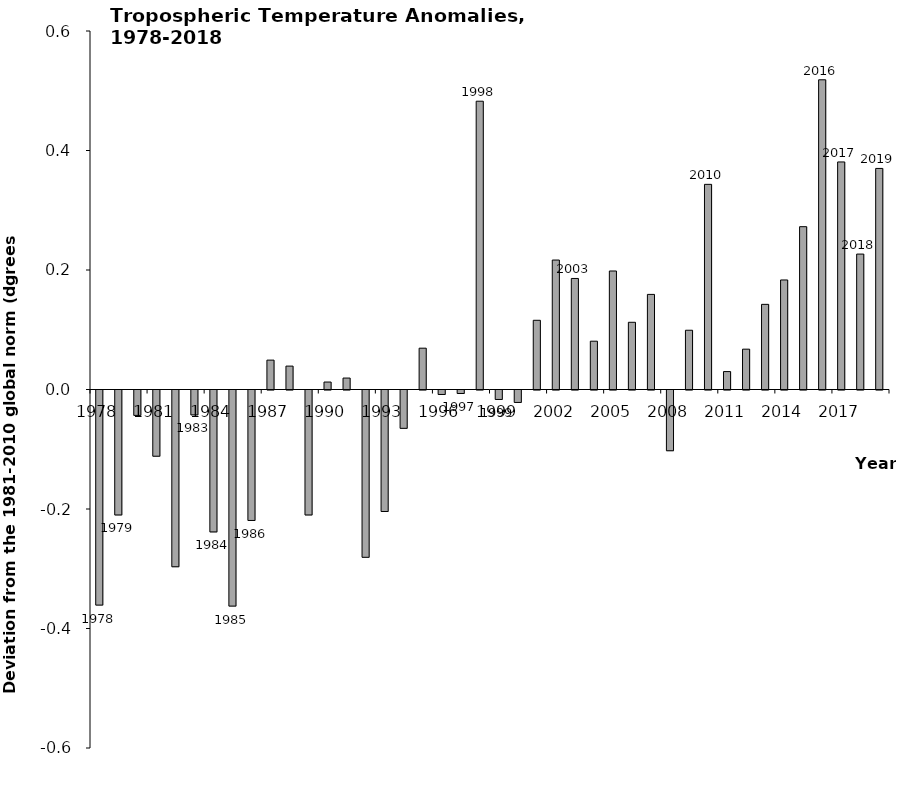
| Category | Series 0 |
|---|---|
| 1978.0 | -0.36 |
| 1979.0 | -0.209 |
| 1980.0 | -0.042 |
| 1981.0 | -0.111 |
| 1982.0 | -0.296 |
| 1983.0 | -0.042 |
| 1984.0 | -0.237 |
| 1985.0 | -0.362 |
| 1986.0 | -0.218 |
| 1987.0 | 0.049 |
| 1988.0 | 0.039 |
| 1989.0 | -0.209 |
| 1990.0 | 0.012 |
| 1991.0 | 0.019 |
| 1992.0 | -0.28 |
| 1993.0 | -0.203 |
| 1994.0 | -0.064 |
| 1995.0 | 0.069 |
| 1996.0 | -0.008 |
| 1997.0 | -0.006 |
| 1998.0 | 0.483 |
| 1999.0 | -0.016 |
| 2000.0 | -0.021 |
| 2001.0 | 0.116 |
| 2002.0 | 0.217 |
| 2003.0 | 0.186 |
| 2004.0 | 0.081 |
| 2005.0 | 0.198 |
| 2006.0 | 0.112 |
| 2007.0 | 0.159 |
| 2008.0 | -0.102 |
| 2009.0 | 0.099 |
| 2010.0 | 0.343 |
| 2011.0 | 0.03 |
| 2012.0 | 0.067 |
| 2013.0 | 0.142 |
| 2014.0 | 0.183 |
| 2015.0 | 0.272 |
| 2016.0 | 0.518 |
| 2017.0 | 0.381 |
| 2018.0 | 0.227 |
| 2019.0 | 0.37 |